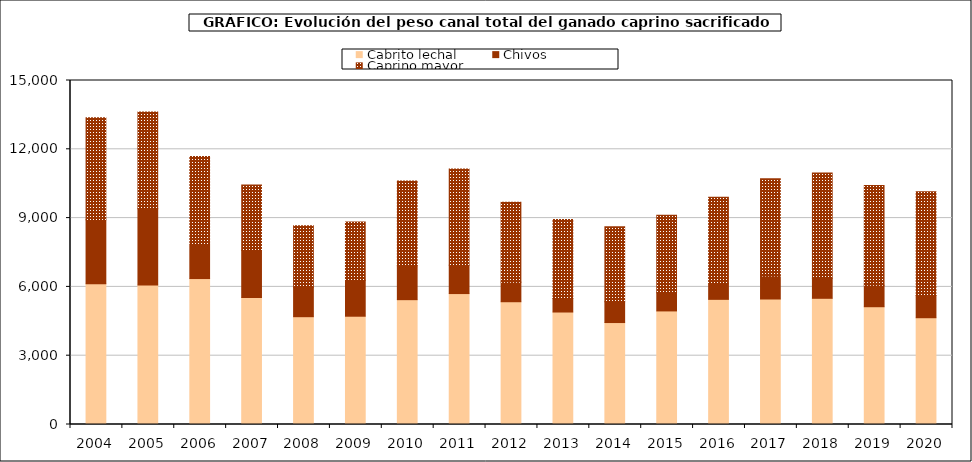
| Category | Cabrito lechal | Chivos | Caprino mayor |
|---|---|---|---|
| 2004.0 | 6133.147 | 2794.229 | 4446.039 |
| 2005.0 | 6081.5 | 3326.197 | 4213.791 |
| 2006.0 | 6363.804 | 1514.071 | 3812.237 |
| 2007.0 | 5538.187 | 2055.519 | 2852.212 |
| 2008.0 | 4700.787 | 1279.039 | 2682.444 |
| 2009.0 | 4721.591 | 1569.493 | 2539.825 |
| 2010.0 | 5443.269 | 1481.101 | 3693.873 |
| 2011.0 | 5709.183 | 1237.105 | 4195.759 |
| 2012.0 | 5353.402 | 854.156 | 3488.702 |
| 2013.0 | 4904.881 | 592.234 | 3442.821 |
| 2014.0 | 4445.773 | 905.526 | 3270.219 |
| 2015.0 | 4952.564 | 787.441 | 3379.656 |
| 2016.0 | 5457.161 | 675.571 | 3771.302 |
| 2017.0 | 5472.065 | 1000.592 | 4240.75 |
| 2018.0 | 5503.007 | 875.093 | 4592.59 |
| 2019.0 | 5135.593 | 934.336 | 4349.983 |
| 2020.0 | 4656.03 | 969.368 | 4523.981 |